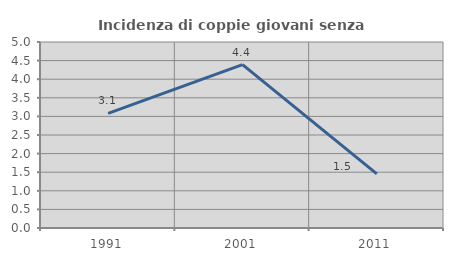
| Category | Incidenza di coppie giovani senza figli |
|---|---|
| 1991.0 | 3.081 |
| 2001.0 | 4.393 |
| 2011.0 | 1.455 |